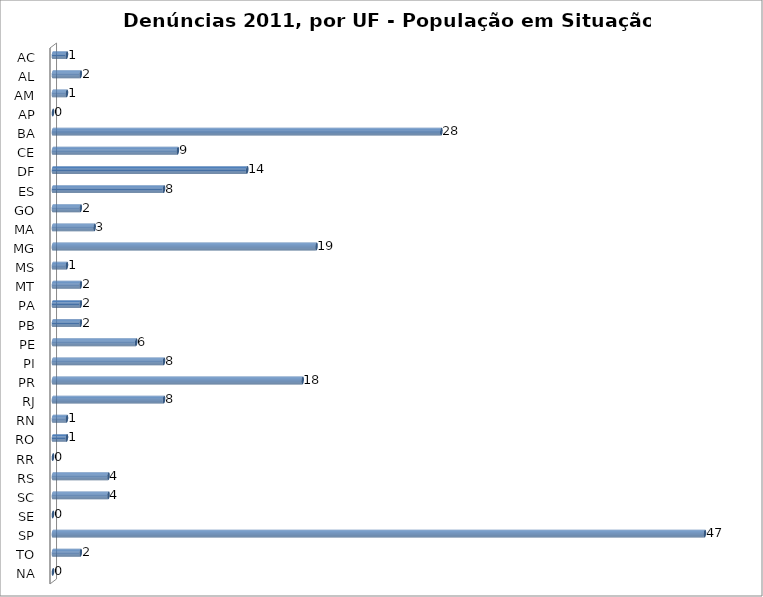
| Category | Series 0 |
|---|---|
| AC | 1 |
| AL | 2 |
| AM | 1 |
| AP | 0 |
| BA | 28 |
| CE | 9 |
| DF | 14 |
| ES | 8 |
| GO | 2 |
| MA | 3 |
| MG | 19 |
| MS | 1 |
| MT | 2 |
| PA | 2 |
| PB | 2 |
| PE | 6 |
| PI | 8 |
| PR | 18 |
| RJ | 8 |
| RN | 1 |
| RO | 1 |
| RR | 0 |
| RS | 4 |
| SC | 4 |
| SE | 0 |
| SP | 47 |
| TO | 2 |
| NA | 0 |